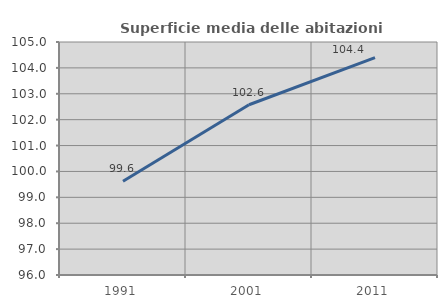
| Category | Superficie media delle abitazioni occupate |
|---|---|
| 1991.0 | 99.62 |
| 2001.0 | 102.575 |
| 2011.0 | 104.395 |